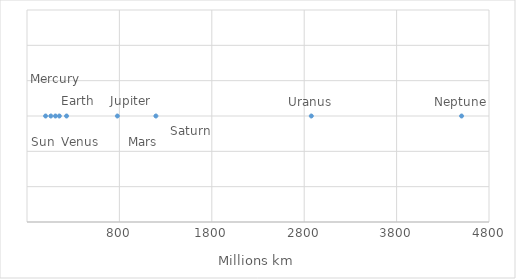
| Category | y |
|---|---|
| 1.0 | 1 |
| 58.0 | 1 |
| 108.0 | 1 |
| 150.0 | 1 |
| 228.0 | 1 |
| 778.0 | 1 |
| 1195.0 | 1 |
| 2877.0 | 1 |
| 4503.0 | 1 |